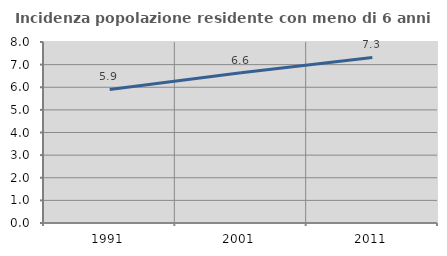
| Category | Incidenza popolazione residente con meno di 6 anni |
|---|---|
| 1991.0 | 5.903 |
| 2001.0 | 6.64 |
| 2011.0 | 7.315 |